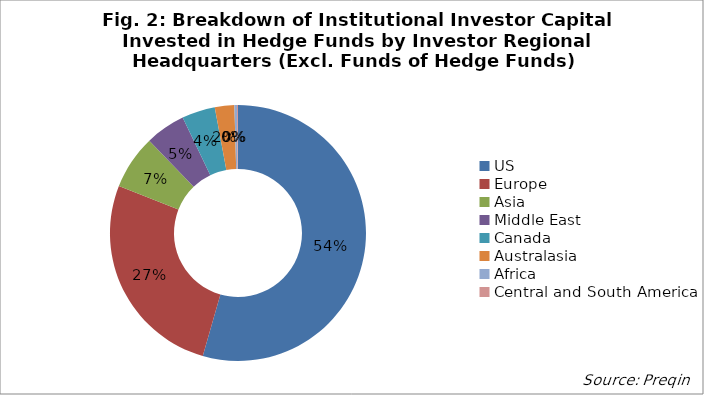
| Category | Proportion |
|---|---|
| US | 0.544 |
| Europe | 0.265 |
| Asia | 0.068 |
| Middle East | 0.051 |
| Canada | 0.042 |
| Australasia | 0.025 |
| Africa | 0.003 |
| Central and South America | 0.001 |